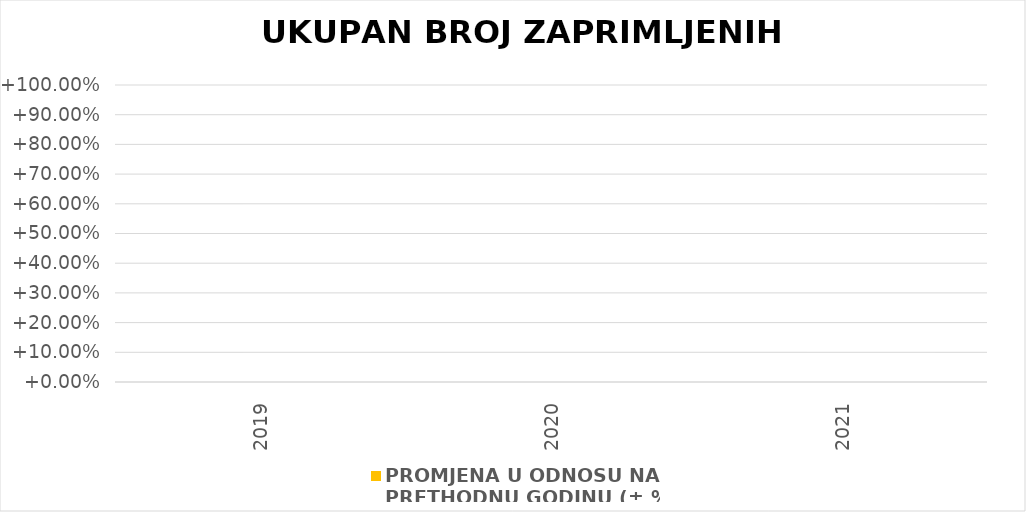
| Category | PROMJENA U ODNOSU NA 
PRETHODNU GODINU (± %) |
|---|---|
| 2019.0 | 0 |
| 2020.0 | 0 |
| 2021.0 | 0 |